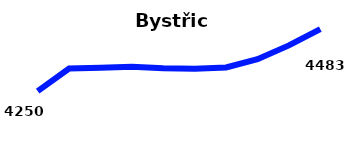
| Category | Bystřice |
|---|---|
| 2010 | 4250 |
| 2011 | 4335 |
| 2012 | 4338 |
| 2013 | 4342 |
| 2014 | 4336 |
| 2015 | 4334 |
| 2016 | 4339 |
| 2017 | 4370 |
| 2018 | 4422 |
| 2019 | 4483 |